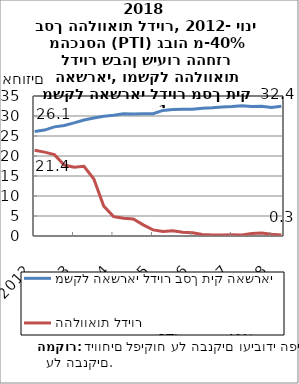
| Category | משקל האשראי לדיור בסך תיק האשראי | משקל ההלוואות לדיור שבהן בשיעור ההחזר מההכנסה PTI גבוה מ-40% בסך ההלוואות לדיור |
|---|---|---|
| 2012-03-31 | 26.116 | 21.436 |
| 2012-06-30 | 26.477 | 20.976 |
| 2012-09-30 | 27.28 | 20.339 |
| 2012-12-31 | 27.63 | 17.737 |
| 2013-03-31 | 28.269 | 17.212 |
| 2013-06-30 | 28.987 | 17.408 |
| 2013-09-30 | 29.486 | 14.23 |
| 2013-12-31 | 29.916 | 7.472 |
| 2014-03-31 | 30.211 | 4.859 |
| 2014-06-30 | 30.562 | 4.459 |
| 2014-09-30 | 30.477 | 4.242 |
| 2014-12-31 | 30.579 | 2.774 |
| 2015-03-31 | 30.578 | 1.525 |
| 2015-06-30 | 31.388 | 1.129 |
| 2015-09-30 | 31.605 | 1.283 |
| 2015-12-31 | 31.663 | 0.961 |
| 2016-03-31 | 31.664 | 0.818 |
| 2016-06-30 | 31.951 | 0.401 |
| 2016-09-30 | 32.04 | 0.23 |
| 2016-12-31 | 32.275 | 0.22 |
| 2017-03-31 | 32.349 | 0.289 |
| 2017-06-30 | 32.539 | 0.235 |
| 2017-09-30 | 32.391 | 0.597 |
| 2017-12-31 | 32.412 | 0.732 |
| 2018-03-31 | 32.157 | 0.459 |
| 2018-06-30 | 32.41 | 0.265 |